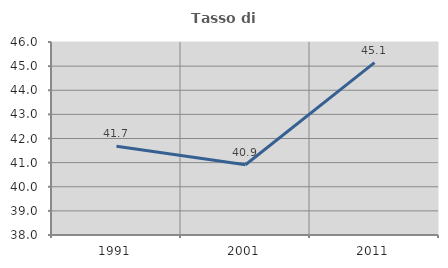
| Category | Tasso di occupazione   |
|---|---|
| 1991.0 | 41.678 |
| 2001.0 | 40.91 |
| 2011.0 | 45.142 |